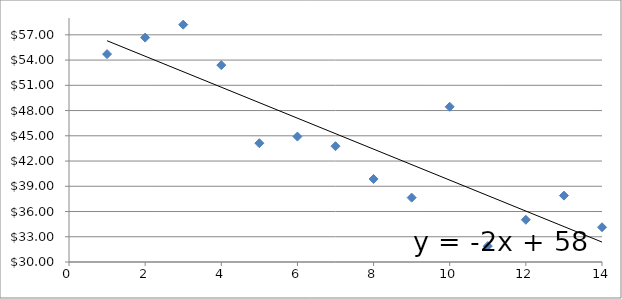
| Category | Series 0 |
|---|---|
| 1.0 | 54.71 |
| 2.0 | 56.67 |
| 3.0 | 58.21 |
| 4.0 | 53.4 |
| 5.0 | 44.12 |
| 6.0 | 44.91 |
| 7.0 | 43.76 |
| 8.0 | 39.87 |
| 9.0 | 37.65 |
| 10.0 | 48.45 |
| 11.0 | 31.89 |
| 12.0 | 35.02 |
| 13.0 | 37.89 |
| 14.0 | 34.13 |